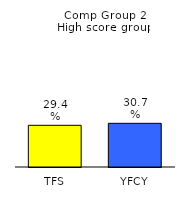
| Category | Series 0 |
|---|---|
| TFS | 0.294 |
| YFCY | 0.307 |